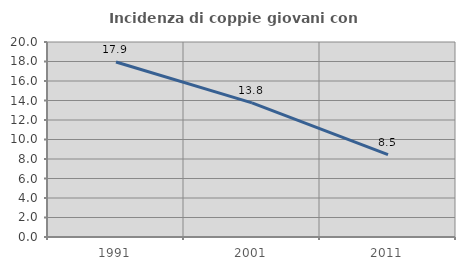
| Category | Incidenza di coppie giovani con figli |
|---|---|
| 1991.0 | 17.949 |
| 2001.0 | 13.75 |
| 2011.0 | 8.451 |